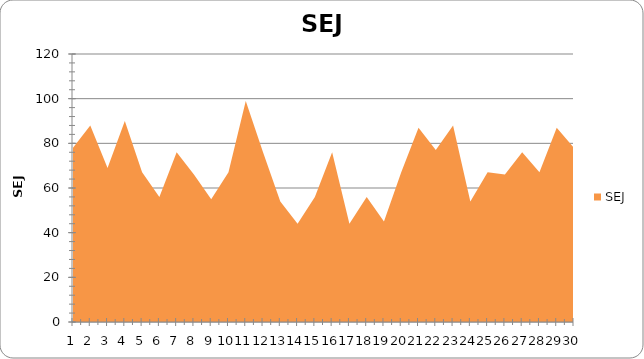
| Category | SEJ |
|---|---|
| 0 | 78 |
| 1 | 88 |
| 2 | 69 |
| 3 | 90 |
| 4 | 67 |
| 5 | 56 |
| 6 | 76 |
| 7 | 66 |
| 8 | 55 |
| 9 | 67 |
| 10 | 99 |
| 11 | 76 |
| 12 | 54 |
| 13 | 44 |
| 14 | 56 |
| 15 | 76 |
| 16 | 44 |
| 17 | 56 |
| 18 | 45 |
| 19 | 67 |
| 20 | 87 |
| 21 | 77 |
| 22 | 88 |
| 23 | 54 |
| 24 | 67 |
| 25 | 66 |
| 26 | 76 |
| 27 | 67 |
| 28 | 87 |
| 29 | 78 |